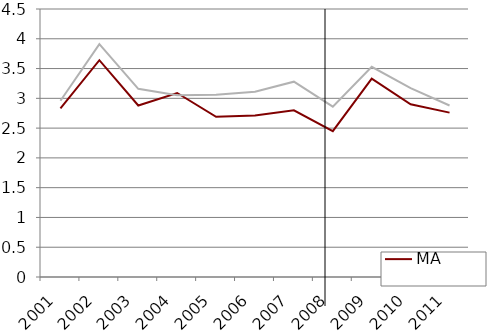
| Category | MA | Northeast |
|---|---|---|
| 2001.0 | 2.83 | 2.96 |
| 2002.0 | 3.64 | 3.91 |
| 2003.0 | 2.88 | 3.16 |
| 2004.0 | 3.09 | 3.05 |
| 2005.0 | 2.69 | 3.06 |
| 2006.0 | 2.71 | 3.11 |
| 2007.0 | 2.8 | 3.28 |
| 2008.0 | 2.45 | 2.86 |
| 2009.0 | 3.33 | 3.53 |
| 2010.0 | 2.9 | 3.17 |
| 2011.0 | 2.76 | 2.88 |